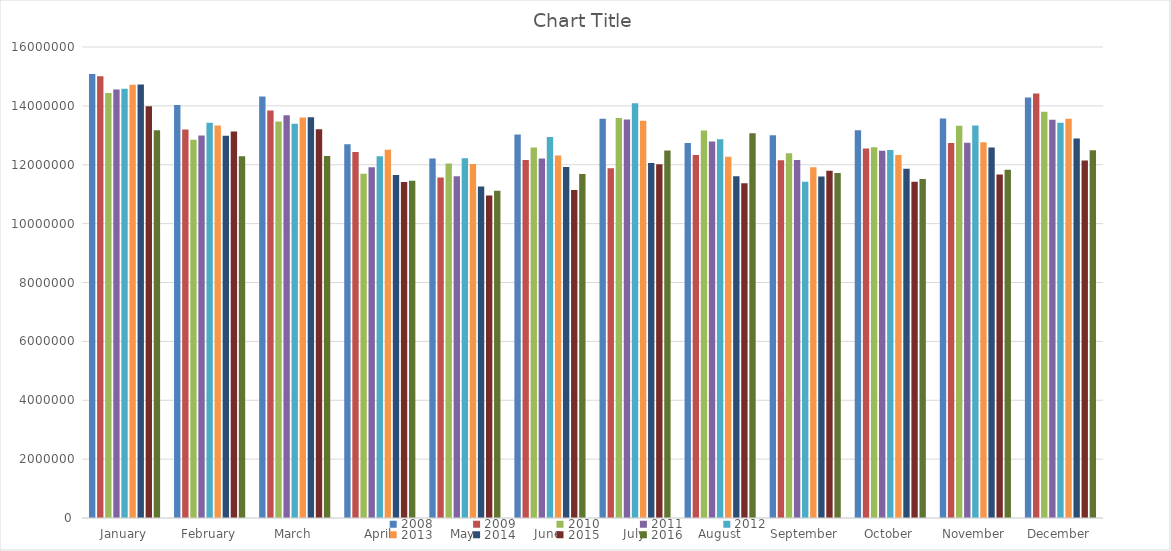
| Category | 2008 | 2009 | 2010 | 2011 | 2012 | 2013 | 2014 | 2015 | 2016 |
|---|---|---|---|---|---|---|---|---|---|
| January | 15082878.82 | 15005142.69 | 14435761.82 | 14553973.74 | 14585568.31 | 14721308.31 | 14721918.53 | 13987815.109 | 13174537.98 |
| February | 14030875.92 | 13197883.27 | 12846380.85 | 12993844.84 | 13424711.96 | 13334088.13 | 12985802.09 | 13128236.122 | 12284962.16 |
| March | 14321155.43 | 13841636.36 | 13466440.77 | 13683974.06 | 13395036.78 | 13602922.4 | 13614018.57 | 13204373.219 | 12300226.49 |
| April | 12696080.17 | 12430879.66 | 11695829.13 | 11913552.88 | 12290763.69 | 12506882.4 | 11649899.12 | 11410552.486 | 11457704.95 |
| May | 12213415.61 | 11568813.37 | 12039396.98 | 11611512.92 | 12220935.48 | 12028746.64 | 11257042.02 | 10958434.445 | 11116983.68 |
| June | 13029843.68 | 12161991.47 | 12588185.24 | 12209704.78 | 12944227.84 | 12310607.66 | 11926426.47 | 11142226.467 | 11688877.68 |
| July | 13562922.75 | 11877269.39 | 13590961.94 | 13541155.95 | 14085492.18 | 13491261.03 | 12057150.84 | 12019416.242 | 12484094.97 |
| August | 12738355.33 | 12331632.6 | 13165945.18 | 12787062.35 | 12866836.79 | 12274415.56 | 11607472.4 | 11373887.692 | 13068297.12 |
| September | 13005195.66 | 12154249.63 | 12387488.95 | 12157224.2 | 11419289.08 | 11911110.81 | 11603450.52 | 11797719.497 | 11716455.57 |
| October | 13176115.98 | 12554878.11 | 12591988.77 | 12479238.46 | 12504352.99 | 12332005.88 | 11860236.59 | 11426239.485 | 11516592.26 |
| November | 13573281.85 | 12741915.07 | 13323219.41 | 12750868.54 | 13335727.78 | 12760586.09 | 12586538.52 | 11667095.194 | 11833726.34 |
| December | 14286723.92 | 14424067.26 | 13800475.36 | 13525392.88 | 13423622.51 | 13566672.9 | 12891166.51 | 12145135.488 | 12494116.59 |